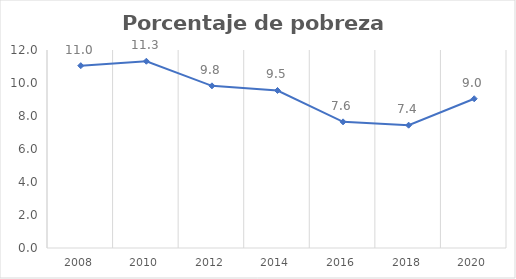
| Category | Series 0 |
|---|---|
| 2008.0 | 11.05 |
| 2010.0 | 11.319 |
| 2012.0 | 9.828 |
| 2014.0 | 9.546 |
| 2016.0 | 7.645 |
| 2018.0 | 7.443 |
| 2020.0 | 9.045 |